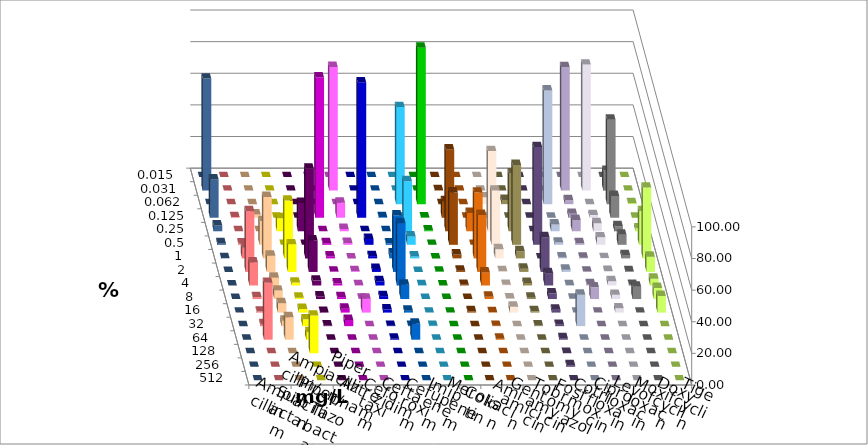
| Category | Ampicillin | Ampicillin/ Sulbactam | Piperacillin | Piperacillin/ Tazobactam | Aztreonam | Cefotaxim | Ceftazidim | Cefuroxim | Imipenem | Meropenem | Colistin | Amikacin | Gentamicin | Tobramycin | Fosfomycin | Cotrimoxazol | Ciprofloxacin | Levofloxacin | Moxifloxacin | Doxycyclin | Tigecyclin |
|---|---|---|---|---|---|---|---|---|---|---|---|---|---|---|---|---|---|---|---|---|---|
| 0.015 | 0 | 0 | 0 | 0 | 0 | 0 | 0 | 0 | 0 | 0 | 0 | 0 | 0 | 0 | 0 | 0 | 0 | 0 | 0 | 0 | 0 |
| 0.031 | 0 | 0 | 0 | 0 | 0 | 78.234 | 0 | 0 | 0 | 0 | 0.205 | 0 | 0 | 0 | 0 | 0 | 78.029 | 79.671 | 12.526 | 0 | 70.842 |
| 0.062 | 0 | 0 | 0 | 0 | 0 | 0 | 0 | 0 | 61.396 | 98.973 | 0 | 0 | 4.312 | 2.669 | 0 | 71.869 | 2.464 | 0 | 53.388 | 0.616 | 0 |
| 0.125 | 0.411 | 2.053 | 0 | 0 | 88.706 | 9.446 | 85.626 | 0.411 | 0 | 0.205 | 10.472 | 0 | 0 | 0 | 0 | 0 | 2.464 | 1.643 | 13.758 | 0 | 24.23 |
| 0.25 | 0 | 0 | 8.214 | 17.864 | 0 | 1.437 | 0 | 0 | 31.622 | 0.616 | 51.745 | 11.594 | 50.719 | 36.55 | 0 | 4.312 | 7.187 | 5.133 | 3.285 | 1.848 | 3.696 |
| 0.5 | 0.821 | 14.99 | 0 | 0 | 1.027 | 1.232 | 3.696 | 0.821 | 5.339 | 0 | 33.06 | 0 | 34.292 | 50.513 | 61.807 | 1.437 | 1.027 | 4.723 | 6.366 | 21.355 | 1.027 |
| 1.0 | 6.776 | 38.809 | 36.55 | 56.674 | 1.232 | 0 | 1.437 | 3.08 | 1.232 | 0 | 2.464 | 41.615 | 5.749 | 4.517 | 0 | 0.616 | 0.411 | 0.205 | 2.053 | 44.764 | 0.205 |
| 2.0 | 38.398 | 10.267 | 17.454 | 19.918 | 0.205 | 0.411 | 1.848 | 35.729 | 0 | 0.205 | 0.821 | 36.025 | 0.411 | 2.053 | 21.971 | 1.437 | 0.205 | 0.616 | 0.411 | 9.651 | 0 |
| 4.0 | 14.579 | 4.928 | 1.848 | 3.08 | 1.232 | 0.205 | 2.669 | 39.425 | 0.205 | 0 | 0.411 | 8.282 | 0.411 | 1.643 | 7.803 | 0.205 | 0.821 | 2.669 | 0.411 | 4.312 | 0 |
| 8.0 | 1.232 | 5.339 | 0.821 | 1.643 | 1.232 | 0.205 | 1.848 | 9.035 | 0 | 0 | 0 | 1.449 | 0.411 | 0.821 | 3.491 | 0.205 | 7.392 | 2.669 | 7.803 | 6.982 | 0 |
| 16.0 | 0.616 | 5.955 | 2.259 | 0.411 | 2.464 | 8.83 | 2.053 | 1.232 | 0 | 0 | 0.821 | 0.207 | 3.696 | 0.821 | 1.848 | 0 | 0 | 2.669 | 0 | 10.472 | 0 |
| 32.0 | 1.232 | 3.491 | 4.312 | 0.411 | 3.901 | 0 | 0.205 | 0.205 | 0.205 | 0 | 0 | 0.207 | 0 | 0.411 | 0.821 | 19.918 | 0 | 0 | 0 | 0 | 0 |
| 64.0 | 35.934 | 14.168 | 4.723 | 0 | 0 | 0 | 0.616 | 10.062 | 0 | 0 | 0 | 0.621 | 0 | 0 | 1.027 | 0 | 0 | 0 | 0 | 0 | 0 |
| 128.0 | 0 | 0 | 23.819 | 0 | 0 | 0 | 0 | 0 | 0 | 0 | 0 | 0 | 0 | 0 | 0.205 | 0 | 0 | 0 | 0 | 0 | 0 |
| 256.0 | 0 | 0 | 0 | 0 | 0 | 0 | 0 | 0 | 0 | 0 | 0 | 0 | 0 | 0 | 1.027 | 0 | 0 | 0 | 0 | 0 | 0 |
| 512.0 | 0 | 0 | 0 | 0 | 0 | 0 | 0 | 0 | 0 | 0 | 0 | 0 | 0 | 0 | 0 | 0 | 0 | 0 | 0 | 0 | 0 |